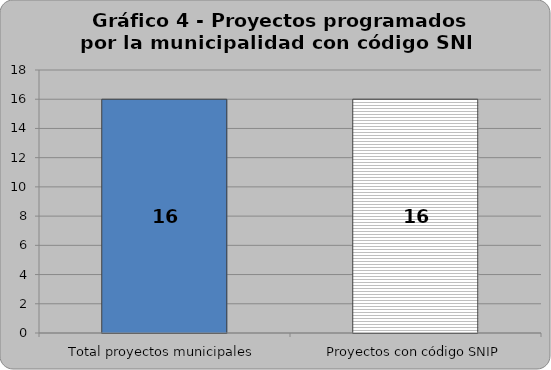
| Category | Proyectos programados por la municipalidad con código SNIP |
|---|---|
| Total proyectos municipales | 16 |
| Proyectos con código SNIP | 16 |